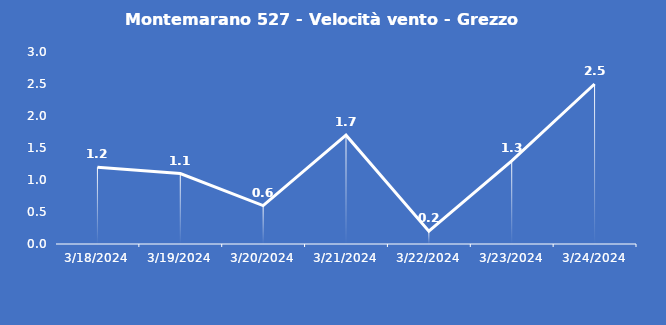
| Category | Montemarano 527 - Velocità vento - Grezzo (m/s) |
|---|---|
| 3/18/24 | 1.2 |
| 3/19/24 | 1.1 |
| 3/20/24 | 0.6 |
| 3/21/24 | 1.7 |
| 3/22/24 | 0.2 |
| 3/23/24 | 1.3 |
| 3/24/24 | 2.5 |